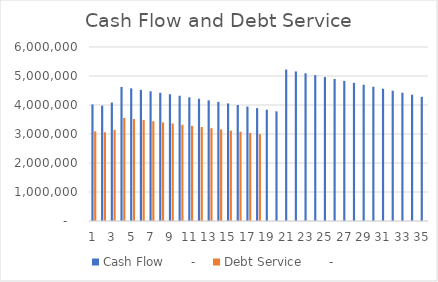
| Category | Cash Flow | Debt Service |
|---|---|---|
| 1.0 | 4018700 | 3091307.692 |
| 2.0 | 3977186.5 | 3059374.231 |
| 3.0 | 4084433.728 | 3141872.099 |
| 4.0 | 4623518.827 | 3556552.944 |
| 5.0 | 4573408.081 | 3518006.216 |
| 6.0 | 4523008.026 | 3479236.943 |
| 7.0 | 4472309.31 | 3440237.931 |
| 8.0 | 4421302.415 | 3401001.858 |
| 9.0 | 4369977.647 | 3361521.267 |
| 10.0 | 4318325.138 | 3321788.567 |
| 11.0 | 4266334.839 | 3281796.03 |
| 12.0 | 4213996.518 | 3241535.783 |
| 13.0 | 4161299.755 | 3200999.812 |
| 14.0 | 4108233.941 | 3160179.955 |
| 15.0 | 4054788.27 | 3119067.9 |
| 16.0 | 4000951.737 | 3077655.182 |
| 17.0 | 3946713.135 | 3035933.18 |
| 18.0 | 3892061.049 | 2993893.114 |
| 19.0 | 3836983.852 | 0 |
| 20.0 | 3781469.705 | 0 |
| 21.0 | 5221901.892 | 0 |
| 22.0 | 5157995.453 | 0 |
| 23.0 | 5093652.608 | 0 |
| 24.0 | 5028860.419 | 0 |
| 25.0 | 4963605.713 | 0 |
| 26.0 | 4897875.073 | 0 |
| 27.0 | 4831654.833 | 0 |
| 28.0 | 4764931.077 | 0 |
| 29.0 | 4697689.631 | 0 |
| 30.0 | 4629916.056 | 0 |
| 31.0 | 4561595.646 | 0 |
| 32.0 | 4492713.422 | 0 |
| 33.0 | 4423254.123 | 0 |
| 34.0 | 4353202.207 | 0 |
| 35.0 | 4282541.838 | 0 |